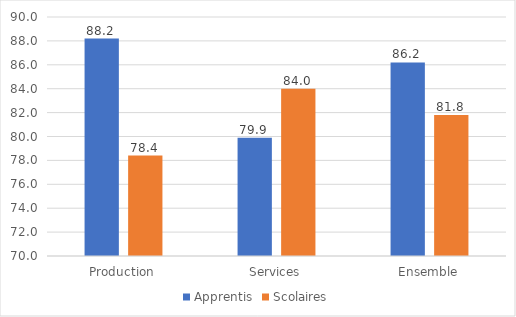
| Category | Apprentis | Scolaires |
|---|---|---|
| Production | 88.2 | 78.4 |
| Services | 79.9 | 84 |
| Ensemble | 86.2 | 81.8 |